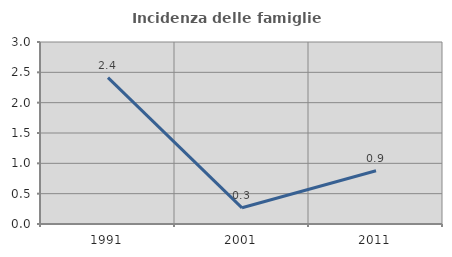
| Category | Incidenza delle famiglie numerose |
|---|---|
| 1991.0 | 2.413 |
| 2001.0 | 0.267 |
| 2011.0 | 0.877 |